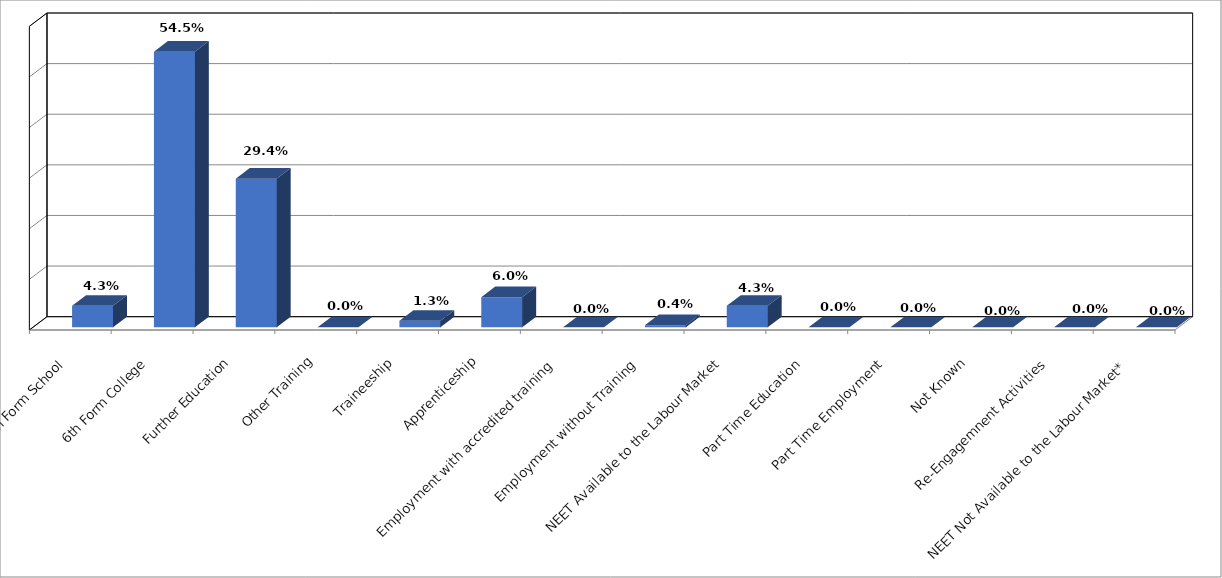
| Category | Series 0 | Series 1 |
|---|---|---|
| 6th Form School |  | 0.043 |
| 6th Form College |  | 0.545 |
| Further Education |  | 0.294 |
| Other Training |  | 0 |
| Traineeship |  | 0.013 |
| Apprenticeship |  | 0.06 |
| Employment with accredited training |  | 0 |
| Employment without Training |  | 0.004 |
| NEET Available to the Labour Market |  | 0.043 |
| Part Time Education |  | 0 |
| Part Time Employment |  | 0 |
| Not Known |  | 0 |
| Re-Engagemnent Activities |  | 0 |
| NEET Not Available to the Labour Market* |  | 0 |